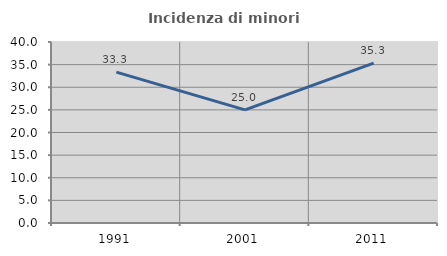
| Category | Incidenza di minori stranieri |
|---|---|
| 1991.0 | 33.333 |
| 2001.0 | 25 |
| 2011.0 | 35.326 |